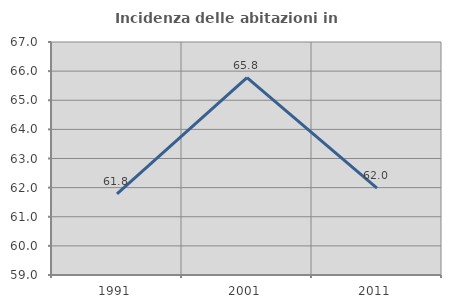
| Category | Incidenza delle abitazioni in proprietà  |
|---|---|
| 1991.0 | 61.789 |
| 2001.0 | 65.778 |
| 2011.0 | 61.981 |